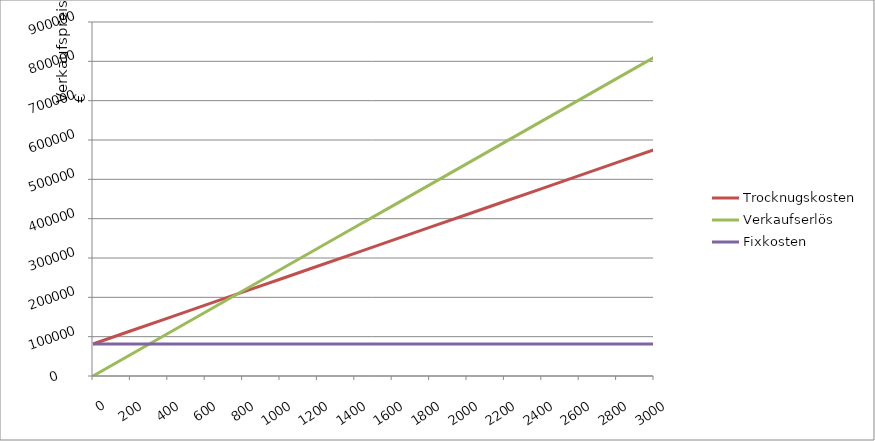
| Category | Trocknugskosten | Verkaufserlös | Fixkosten |
|---|---|---|---|
| 0.0 | 81460.317 | 0 | 81460.317 |
| 200.0 | 114380.732 | 54000 | 81460.317 |
| 400.0 | 147301.147 | 108000 | 81460.317 |
| 600.0 | 180221.561 | 162000 | 81460.317 |
| 800.0 | 213141.976 | 216000 | 81460.317 |
| 1000.0 | 246062.39 | 270000 | 81460.317 |
| 1200.0 | 278982.805 | 324000 | 81460.317 |
| 1400.0 | 311903.219 | 378000 | 81460.317 |
| 1600.0 | 344823.634 | 432000 | 81460.317 |
| 1800.0 | 377744.048 | 486000 | 81460.317 |
| 2000.0 | 410664.463 | 540000 | 81460.317 |
| 2200.0 | 443584.878 | 594000 | 81460.317 |
| 2400.0 | 476505.292 | 648000 | 81460.317 |
| 2600.0 | 509425.707 | 702000 | 81460.317 |
| 2800.0 | 542346.121 | 756000 | 81460.317 |
| 3000.0 | 575266.536 | 810000 | 81460.317 |